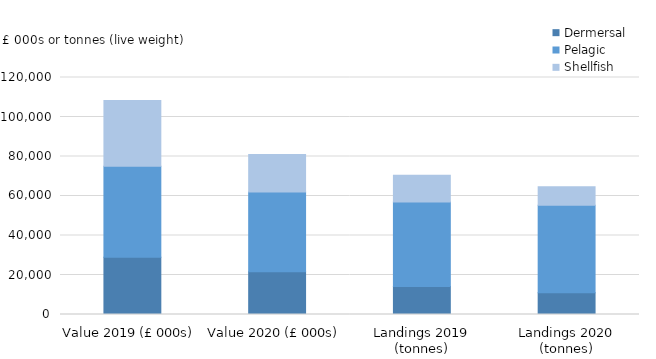
| Category | Dermersal | Pelagic | Shellfish |
|---|---|---|---|
| 0 | 29012 | 46113.027 | 33284.397 |
| 1 | 21582.368 | 40496.814 | 18889.984 |
| 2 | 14224.778 | 42707.386 | 13578.062 |
| 3 | 11000.287 | 44308.824 | 9317.286 |